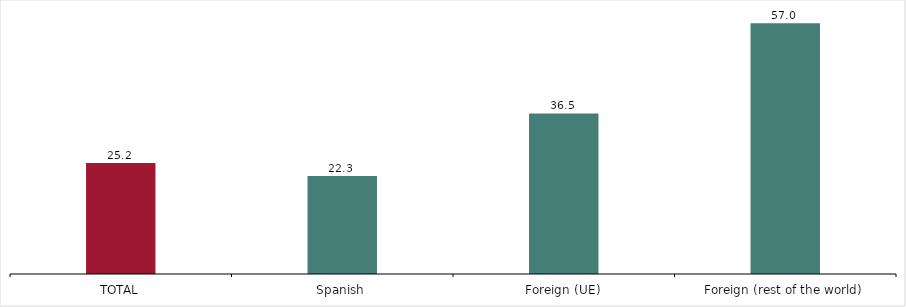
| Category | Por nacionalidad |
|---|---|
| TOTAL | 25.2 |
| Spanish | 22.3 |
| Foreign (UE) | 36.5 |
| Foreign (rest of the world) | 57 |